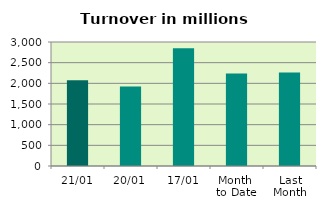
| Category | Series 0 |
|---|---|
| 21/01 | 2071.858 |
| 20/01 | 1923.667 |
| 17/01 | 2849.022 |
| Month 
to Date | 2236.091 |
| Last
Month | 2262.611 |